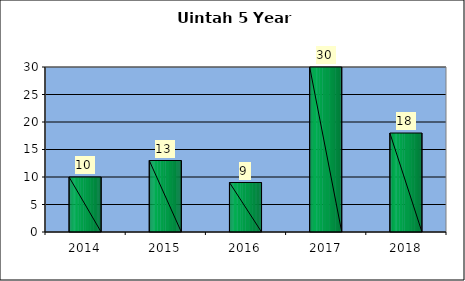
| Category | Washington Terrace March 5 Year Comparison |
|---|---|
| 0 | 10 |
| 1 | 13 |
| 2 | 9 |
| 3 | 30 |
| 4 | 18 |